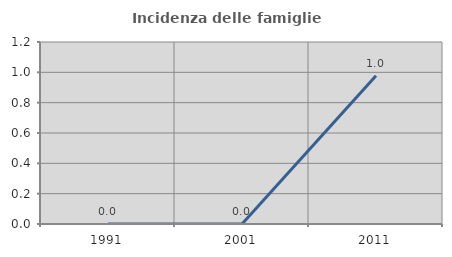
| Category | Incidenza delle famiglie numerose |
|---|---|
| 1991.0 | 0 |
| 2001.0 | 0 |
| 2011.0 | 0.977 |